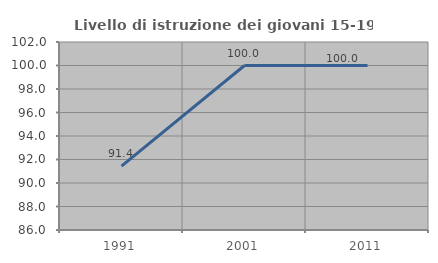
| Category | Livello di istruzione dei giovani 15-19 anni |
|---|---|
| 1991.0 | 91.429 |
| 2001.0 | 100 |
| 2011.0 | 100 |